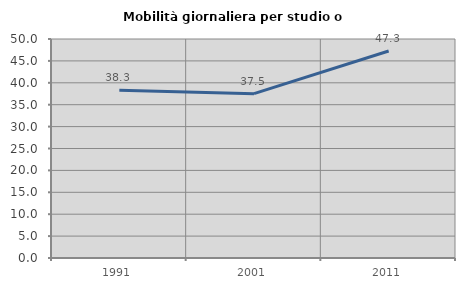
| Category | Mobilità giornaliera per studio o lavoro |
|---|---|
| 1991.0 | 38.294 |
| 2001.0 | 37.517 |
| 2011.0 | 47.266 |